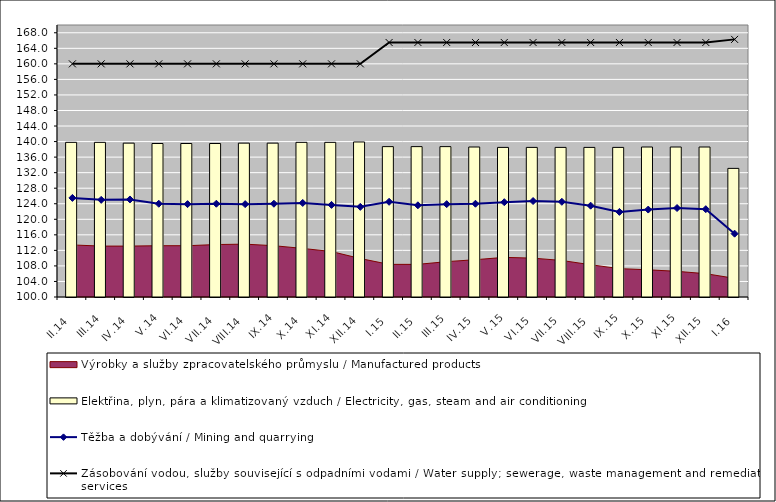
| Category | Elektřina, plyn, pára a klimatizovaný vzduch / Electricity, gas, steam and air conditioning |
|---|---|
| II.14 | 139.8 |
| III.14 | 139.8 |
| IV.14 | 139.6 |
| V.14 | 139.5 |
| VI.14 | 139.5 |
| VII.14 | 139.5 |
| VIII.14 | 139.6 |
| IX.14 | 139.6 |
| X.14 | 139.8 |
| XI.14 | 139.8 |
| XII.14 | 139.9 |
| I.15 | 138.7 |
| II.15 | 138.7 |
| III.15 | 138.7 |
| IV.15 | 138.6 |
| V.15 | 138.5 |
| VI.15 | 138.5 |
| VII.15 | 138.5 |
| VIII.15 | 138.5 |
| IX.15 | 138.5 |
| X.15 | 138.6 |
| XI.15 | 138.6 |
| XII.15 | 138.6 |
| I.16 | 133.1 |